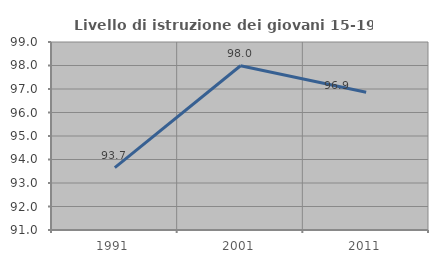
| Category | Livello di istruzione dei giovani 15-19 anni |
|---|---|
| 1991.0 | 93.656 |
| 2001.0 | 97.989 |
| 2011.0 | 96.863 |